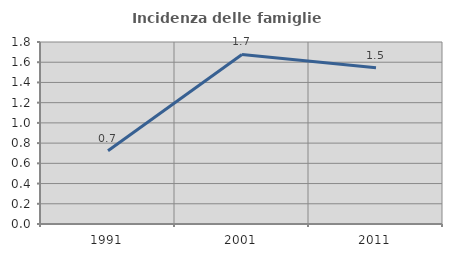
| Category | Incidenza delle famiglie numerose |
|---|---|
| 1991.0 | 0.725 |
| 2001.0 | 1.677 |
| 2011.0 | 1.545 |